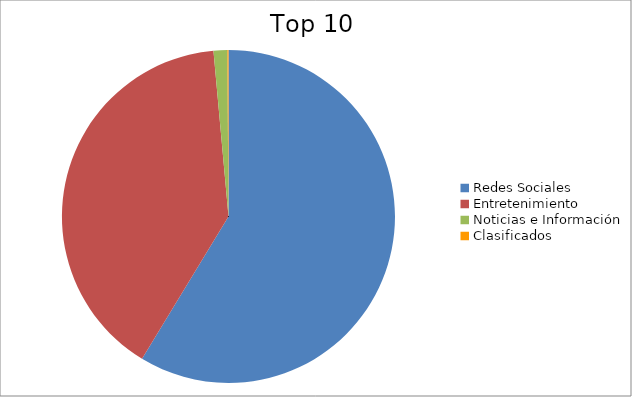
| Category | Series 0 |
|---|---|
| Redes Sociales | 58.69 |
| Entretenimiento | 39.87 |
| Noticias e Información | 1.33 |
| Clasificados | 0.11 |